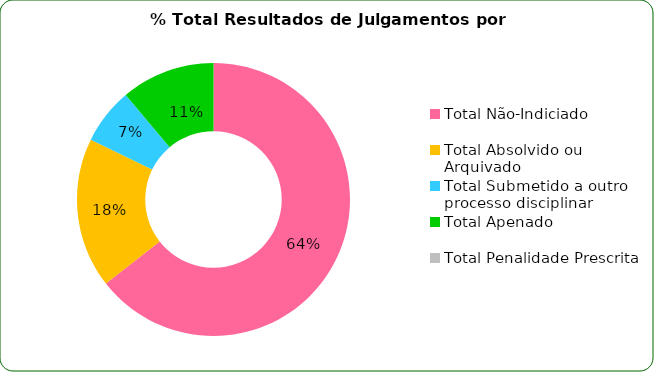
| Category | % Total |
|---|---|
| Total Não-Indiciado | 0.644 |
| Total Absolvido ou Arquivado | 0.178 |
| Total Submetido a outro processo disciplinar | 0.067 |
| Total Apenado | 0.111 |
| Total Penalidade Prescrita | 0 |